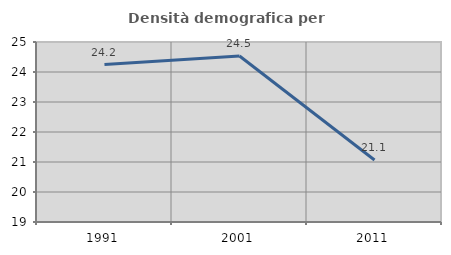
| Category | Densità demografica |
|---|---|
| 1991.0 | 24.248 |
| 2001.0 | 24.532 |
| 2011.0 | 21.068 |